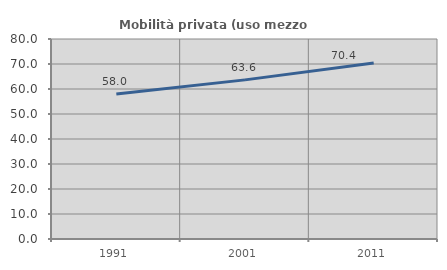
| Category | Mobilità privata (uso mezzo privato) |
|---|---|
| 1991.0 | 57.981 |
| 2001.0 | 63.649 |
| 2011.0 | 70.437 |